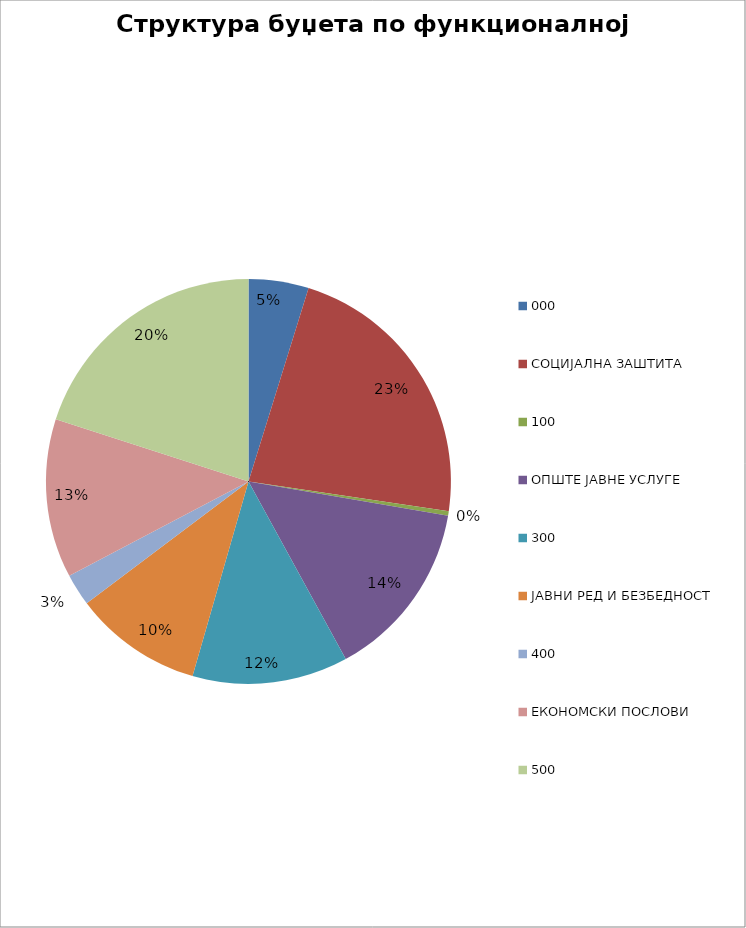
| Category | Series 0 |
|---|---|
| 0 | 42320000 |
| 1 | 199000000 |
| 2 | 3120000 |
| 3 | 126450000 |
| 4 | 109700000 |
| 5 | 90640000 |
| 6 | 22600000 |
| 7 | 111890000 |
| 8 | 176780000 |